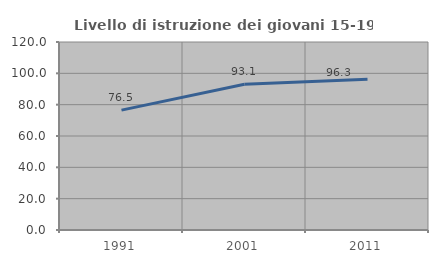
| Category | Livello di istruzione dei giovani 15-19 anni |
|---|---|
| 1991.0 | 76.498 |
| 2001.0 | 93.089 |
| 2011.0 | 96.298 |